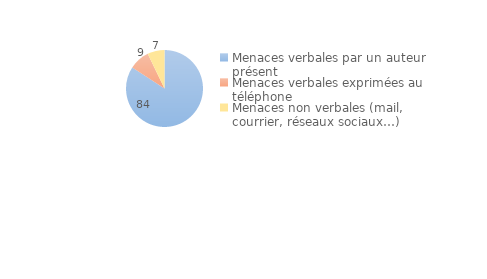
| Category | Series 0 |
|---|---|
| Menaces verbales par un auteur présent | 84.107 |
| Menaces verbales exprimées au téléphone | 8.593 |
| Menaces non verbales (mail, courrier, réseaux sociaux…) | 7.154 |